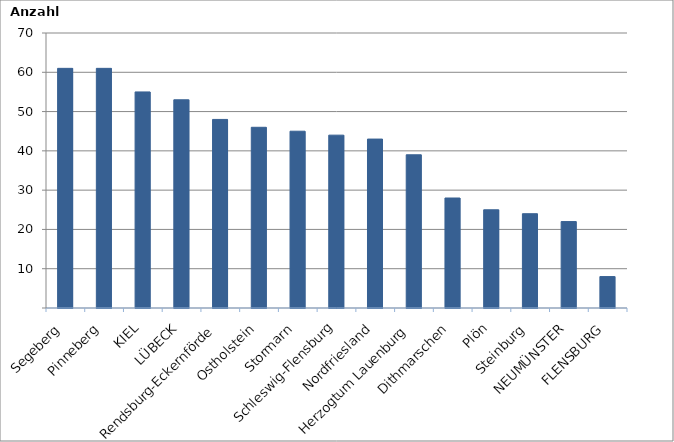
| Category | Series 0 |
|---|---|
| Segeberg | 61 |
| Pinneberg | 61 |
| KIEL | 55 |
| LÜBECK | 53 |
| Rendsburg-Eckernförde | 48 |
| Ostholstein | 46 |
| Stormarn | 45 |
| Schleswig-Flensburg | 44 |
| Nordfriesland | 43 |
| Herzogtum Lauenburg | 39 |
| Dithmarschen | 28 |
| Plön | 25 |
| Steinburg | 24 |
| NEUMÜNSTER | 22 |
| FLENSBURG | 8 |